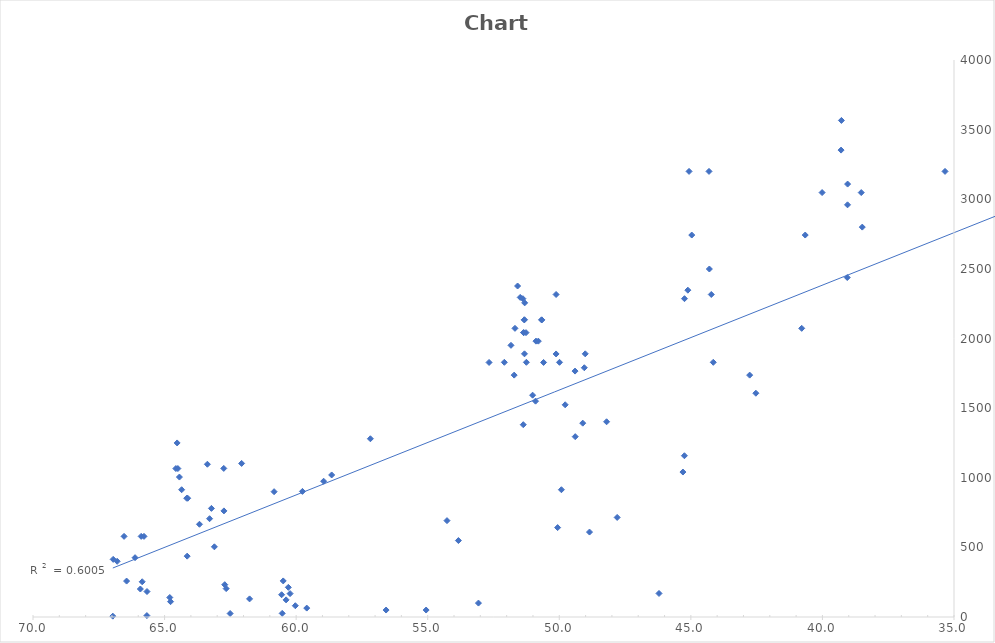
| Category | Series 0 |
|---|---|
| 66.96659 | 6 |
| 66.953158 | 414 |
| 66.801085 | 400 |
| 66.538672 | 579 |
| 66.443262 | 258 |
| 66.121283 | 426 |
| 65.920704 | 201 |
| 65.889379 | 579 |
| 65.849888 | 253 |
| 65.782223 | 579 |
| 65.671913 | 10 |
| 65.667492 | 183 |
| 64.802297 | 140 |
| 64.772184 | 110 |
| 64.570107 | 1066 |
| 64.522798 | 1250 |
| 64.494859 | 1066 |
| 64.435579 | 1005 |
| 64.350766 | 914 |
| 64.158259 | 853 |
| 64.141594 | 437 |
| 64.12048 | 853 |
| 63.673114 | 666 |
| 63.373343 | 1097 |
| 63.289882 | 706 |
| 63.219969 | 780 |
| 63.107077 | 504 |
| 62.750337 | 1067 |
| 62.744289 | 762 |
| 62.712553 | 232 |
| 62.659197 | 204 |
| 62.507665 | 25 |
| 62.071567 | 1103 |
| 61.769507 | 130 |
| 60.83796 | 900 |
| 60.551801 | 160 |
| 60.530318 | 26 |
| 60.491659 | 259 |
| 60.381551 | 123 |
| 60.296881 | 213 |
| 60.229785 | 168 |
| 60.031715 | 81 |
| 59.761054 | 902 |
| 59.597463 | 64 |
| 58.955482 | 975 |
| 58.64949 | 1020 |
| 57.178706 | 1280 |
| 56.581737 | 50 |
| 55.060262 | 50 |
| 54.267683 | 692 |
| 53.833616 | 549 |
| 53.072123 | 100 |
| 52.668921 | 1828 |
| 52.088043 | 1829 |
| 51.835612 | 1951 |
| 51.714543 | 1737 |
| 51.684292 | 2073 |
| 51.584746 | 2377 |
| 51.484587 | 2295 |
| 51.38254 | 2286 |
| 51.369188 | 1381 |
| 51.355817 | 2042 |
| 51.35496 | 2042 |
| 51.328599 | 2134 |
| 51.326114 | 2134 |
| 51.32306 | 1890 |
| 51.315635 | 2256 |
| 51.264368 | 2042 |
| 51.250654 | 1829 |
| 51.013327 | 1593 |
| 50.902273 | 1550 |
| 50.885923 | 1981 |
| 50.796829 | 1981 |
| 50.671004 | 2134 |
| 50.666452 | 2133 |
| 50.596992 | 1828 |
| 50.12162 | 2316 |
| 50.121591 | 1889 |
| 50.062918 | 642 |
| 49.99125 | 1829 |
| 49.919083 | 914 |
| 49.776141 | 1524 |
| 49.394644 | 1295 |
| 49.401555 | 1766 |
| 49.108593 | 1392 |
| 49.050084 | 1790 |
| 49.013773 | 1890 |
| 48.851524 | 610 |
| 48.202767 | 1402 |
| 47.8 | 715 |
| 46.210286 | 169 |
| 45.301462 | 1041 |
| 45.244592 | 1158 |
| 45.242331 | 2286 |
| 45.11441 | 2347 |
| 45.068057 | 3200 |
| 44.965723 | 2743 |
| 44.309977 | 3200 |
| 44.296321 | 2499 |
| 44.223878 | 2316 |
| 44.148427 | 1829 |
| 42.765889 | 1737 |
| 42.529612 | 1607 |
| 40.787169 | 2073 |
| 40.654018 | 2743 |
| 40.012158 | 3048 |
| 39.291383 | 3353 |
| 39.278273 | 3566 |
| 39.056571 | 2438 |
| 39.045847 | 2960 |
| 39.043172 | 3109 |
| 38.524826 | 3048 |
| 38.485782 | 2800 |
| 35.340515 | 3200 |